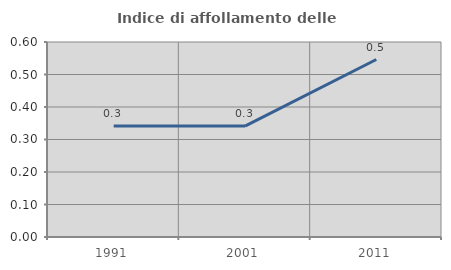
| Category | Indice di affollamento delle abitazioni  |
|---|---|
| 1991.0 | 0.341 |
| 2001.0 | 0.341 |
| 2011.0 | 0.546 |